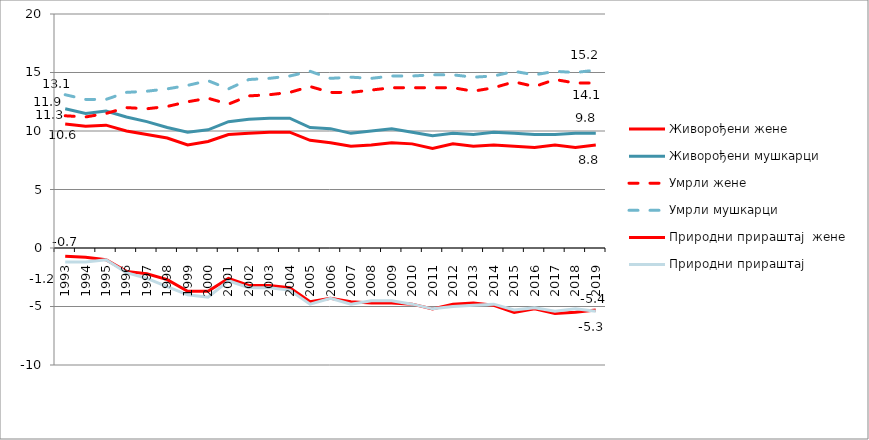
| Category | Живорођени | Умрли | Природни прираштај  |
|---|---|---|---|
| 1993.0 | 11.9 | 13.1 | -1.2 |
| 1994.0 | 11.5 | 12.7 | -1.2 |
| 1995.0 | 11.7 | 12.7 | -1 |
| 1996.0 | 11.2 | 13.3 | -2.1 |
| 1997.0 | 10.8 | 13.4 | -2.6 |
| 1998.0 | 10.3 | 13.6 | -3.3 |
| 1999.0 | 9.9 | 13.9 | -4 |
| 2000.0 | 10.1 | 14.3 | -4.2 |
| 2001.0 | 10.8 | 13.6 | -2.8 |
| 2002.0 | 11 | 14.4 | -3.4 |
| 2003.0 | 11.1 | 14.5 | -3.4 |
| 2004.0 | 11.1 | 14.7 | -3.6 |
| 2005.0 | 10.3 | 15.1 | -4.8 |
| 2006.0 | 10.2 | 14.5 | -4.3 |
| 2007.0 | 9.8 | 14.6 | -4.8 |
| 2008.0 | 10 | 14.5 | -4.5 |
| 2009.0 | 10.2 | 14.7 | -4.5 |
| 2010.0 | 9.9 | 14.7 | -4.8 |
| 2011.0 | 9.6 | 14.8 | -5.2 |
| 2012.0 | 9.8 | 14.8 | -5 |
| 2013.0 | 9.7 | 14.6 | -4.9 |
| 2014.0 | 9.9 | 14.7 | -4.8 |
| 2015.0 | 9.8 | 15.1 | -5.3 |
| 2016.0 | 9.7 | 14.8 | -5.1 |
| 2017.0 | 9.7 | 15.1 | -5.4 |
| 2018.0 | 9.8 | 15 | -5.2 |
| 2019.0 | 9.8 | 15.2 | -5.4 |